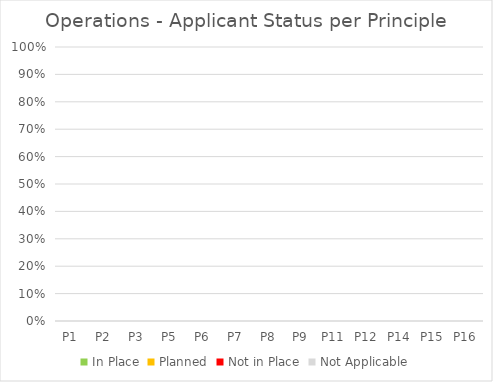
| Category | In Place | Planned | Not in Place | Not Applicable |
|---|---|---|---|---|
| P1 | 0 | 0 | 0 | 0 |
| P2 | 0 | 0 | 0 | 0 |
| P3 | 0 | 0 | 0 | 0 |
| P5 | 0 | 0 | 0 | 0 |
| P6 | 0 | 0 | 0 | 0 |
| P7 | 0 | 0 | 0 | 0 |
| P8 | 0 | 0 | 0 | 0 |
| P9 | 0 | 0 | 0 | 0 |
| P11 | 0 | 0 | 0 | 0 |
| P12 | 0 | 0 | 0 | 0 |
| P14 | 0 | 0 | 0 | 0 |
| P15 | 0 | 0 | 0 | 0 |
| P16 | 0 | 0 | 0 | 0 |